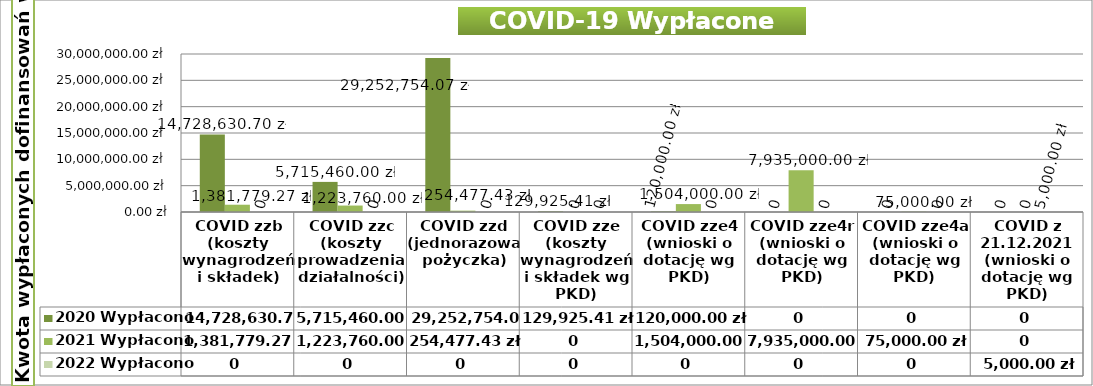
| Category | 2020 Wypłacono | 2021 Wypłacono | 2022 Wypłacono |
|---|---|---|---|
| COVID zzb (koszty wynagrodzeń i składek) | 14728630.7 | 1381779.27 | 0 |
| COVID zzc (koszty prowadzenia działalności) | 5715460 | 1223760 | 0 |
| COVID zzd (jednorazowa pożyczka) | 29252754.07 | 254477.43 | 0 |
| COVID zze (koszty wynagrodzeń i składek wg PKD) | 129925.41 | 0 | 0 |
| COVID zze4 (wnioski o dotację wg PKD) | 120000 | 1504000 | 0 |
| COVID zze4r (wnioski o dotację wg PKD) | 0 | 7935000 | 0 |
| COVID zze4a (wnioski o dotację wg PKD) | 0 | 75000 | 0 |
| COVID z 21.12.2021 (wnioski o dotację wg PKD) | 0 | 0 | 5000 |